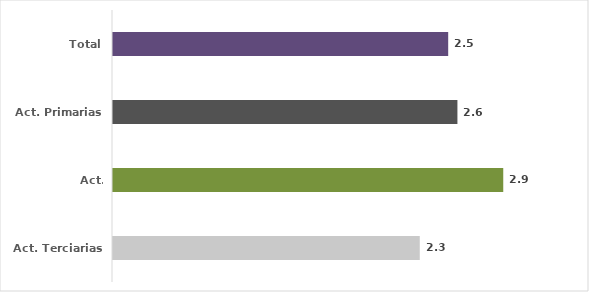
| Category | Series 0 |
|---|---|
| Act. Terciarias | 2.299 |
| Act. Secundarias | 2.925 |
| Act. Primarias | 2.581 |
| Total | 2.512 |